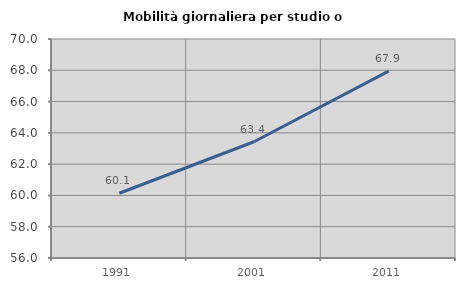
| Category | Mobilità giornaliera per studio o lavoro |
|---|---|
| 1991.0 | 60.138 |
| 2001.0 | 63.432 |
| 2011.0 | 67.945 |